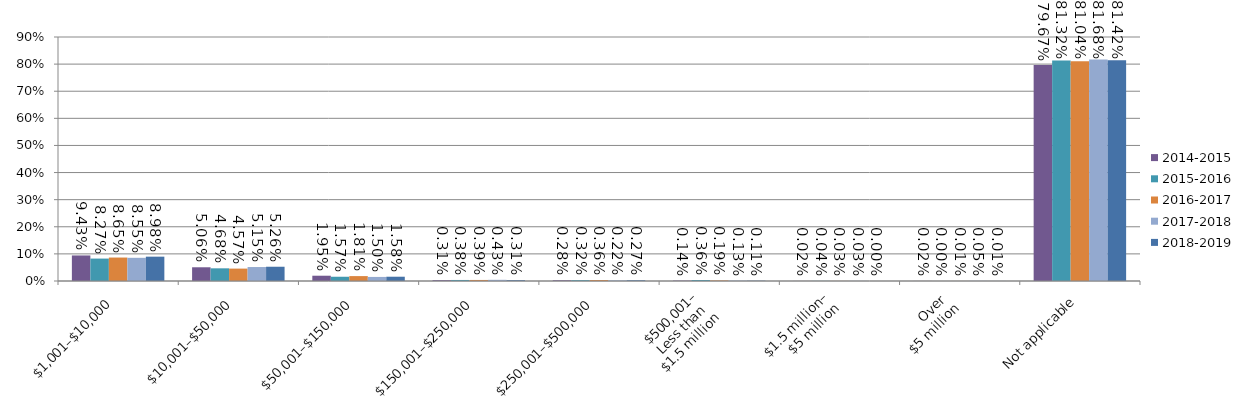
| Category | 2014-2015 | 2015-2016 | 2016-2017 | 2017-2018 | 2018-2019 |
|---|---|---|---|---|---|
| $1,001–$10,000 | 0.094 | 0.083 | 0.087 | 0.086 | 0.09 |
| $10,001–$50,000 | 0.051 | 0.047 | 0.046 | 0.052 | 0.053 |
| $50,001–$150,000 | 0.019 | 0.016 | 0.018 | 0.015 | 0.016 |
| $150,001–$250,000 | 0.003 | 0.004 | 0.004 | 0.004 | 0.003 |
| $250,001–$500,000 | 0.003 | 0.003 | 0.004 | 0.002 | 0.003 |
| $500,001–
Less than 
$1.5 million | 0.001 | 0.004 | 0.002 | 0.001 | 0.001 |
| $1.5 million–
$5 million | 0 | 0 | 0 | 0 | 0 |
| Over 
$5 million | 0 | 0 | 0 | 0.001 | 0 |
| Not applicable | 0.797 | 0.813 | 0.81 | 0.817 | 0.814 |